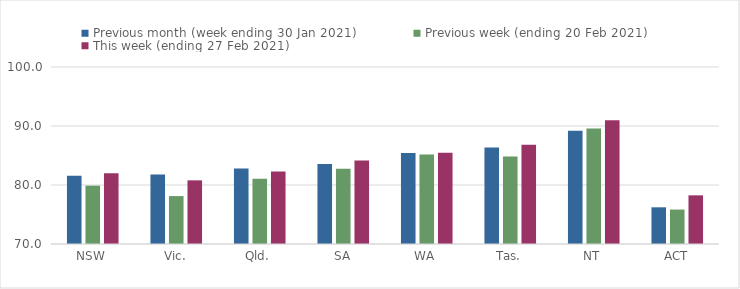
| Category | Previous month (week ending 30 Jan 2021) | Previous week (ending 20 Feb 2021) | This week (ending 27 Feb 2021) |
|---|---|---|---|
| NSW | 81.55 | 79.89 | 82 |
| Vic. | 81.79 | 78.12 | 80.79 |
| Qld. | 82.81 | 81.06 | 82.27 |
| SA | 83.54 | 82.77 | 84.17 |
| WA | 85.42 | 85.15 | 85.46 |
| Tas. | 86.35 | 84.82 | 86.83 |
| NT | 89.2 | 89.56 | 90.97 |
| ACT | 76.22 | 75.84 | 78.25 |